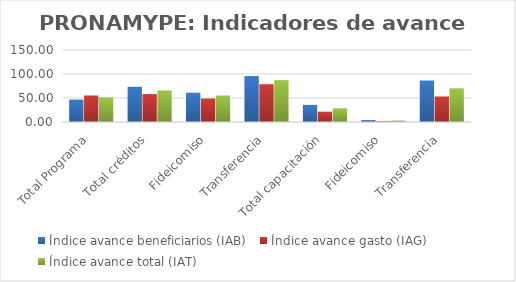
| Category | Índice avance beneficiarios (IAB)  | Índice avance gasto (IAG) | Índice avance total (IAT)  |
|---|---|---|---|
| Total Programa | 46.605 | 55.079 | 50.842 |
| Total créditos | 73.295 | 58.205 | 65.75 |
| Fideicomiso | 60.879 | 48.792 | 54.835 |
| Transferencia | 95.723 | 78.738 | 87.231 |
| Total capacitación | 35.624 | 21.421 | 28.523 |
| Fideicomiso | 3.993 | 1.726 | 2.86 |
| Transferencia | 86.453 | 53.065 | 69.759 |